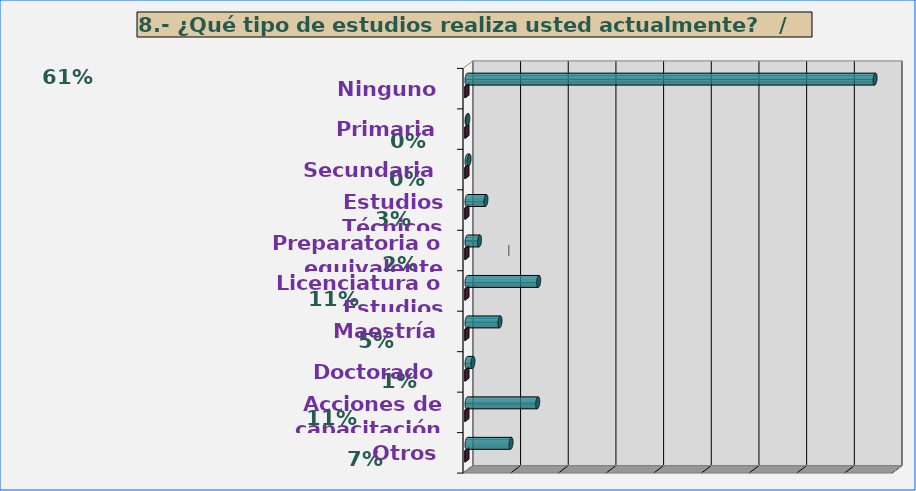
| Category | Series 0 | Series 1 |
|---|---|---|
| Ninguno | 8559 | 0.611 |
| Primaria | 18 | 0.001 |
| Secundaria | 44 | 0.003 |
| Estudios Técnicos | 397 | 0.028 |
| Preparatoria o equivalente | 263 | 0.019 |
| Licenciatura o Estudios Profesionales | 1504 | 0.107 |
| Maestría | 692 | 0.049 |
| Doctorado | 125 | 0.009 |
| Acciones de capacitación | 1483 | 0.106 |
| Otros | 924 | 0.066 |